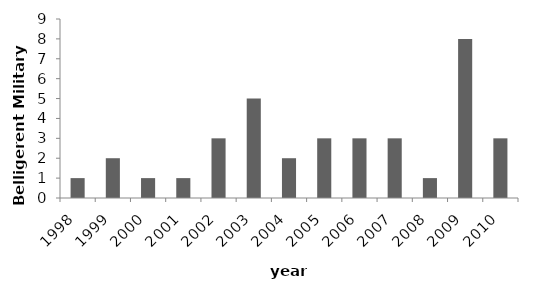
| Category | BEMA |
|---|---|
| 1998.0 | 1 |
| 1999.0 | 2 |
| 2000.0 | 1 |
| 2001.0 | 1 |
| 2002.0 | 3 |
| 2003.0 | 5 |
| 2004.0 | 2 |
| 2005.0 | 3 |
| 2006.0 | 3 |
| 2007.0 | 3 |
| 2008.0 | 1 |
| 2009.0 | 8 |
| 2010.0 | 3 |